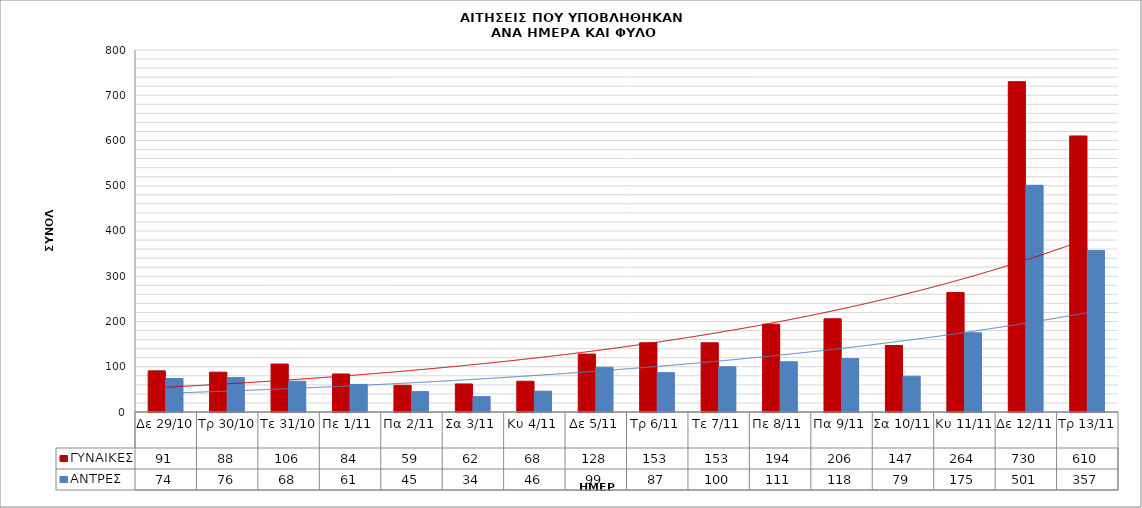
| Category | ΓΥΝΑΙΚΕΣ | ΑΝΤΡΕΣ |
|---|---|---|
| Δε 29/10 | 91 | 74 |
| Τρ 30/10 | 88 | 76 |
| Τε 31/10 | 106 | 68 |
| Πε 1/11 | 84 | 61 |
| Πα 2/11 | 59 | 45 |
| Σα 3/11 | 62 | 34 |
| Κυ 4/11 | 68 | 46 |
| Δε 5/11 | 128 | 99 |
| Τρ 6/11 | 153 | 87 |
| Τε 7/11 | 153 | 100 |
| Πε 8/11 | 194 | 111 |
| Πα 9/11 | 206 | 118 |
| Σα 10/11 | 147 | 79 |
| Κυ 11/11 | 264 | 175 |
| Δε 12/11 | 730 | 501 |
| Τρ 13/11 | 610 | 357 |